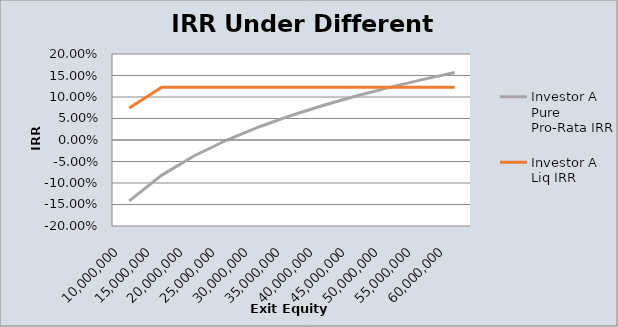
| Category | Investor A Pure Pro-Rata IRR | Investor A Liq IRR |
|---|---|---|
| 10000000.0 | -0.142 | 0.074 |
| 15000000.0 | -0.082 | 0.122 |
| 20000000.0 | -0.037 | 0.122 |
| 25000000.0 | 0 | 0.122 |
| 30000000.0 | 0.031 | 0.122 |
| 35000000.0 | 0.058 | 0.122 |
| 40000000.0 | 0.081 | 0.122 |
| 45000000.0 | 0.103 | 0.122 |
| 50000000.0 | 0.122 | 0.122 |
| 55000000.0 | 0.14 | 0.122 |
| 60000000.0 | 0.157 | 0.122 |